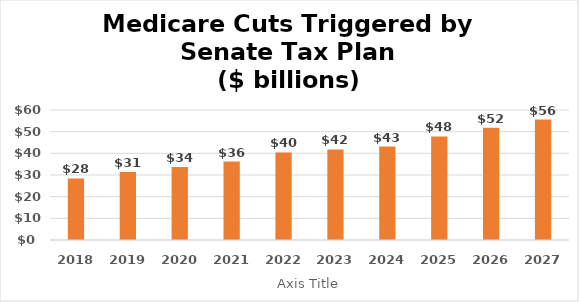
| Category | 4% sequestration |
|---|---|
| 2018.0 | 28.433 |
| 2019.0 | 31.347 |
| 2020.0 | 33.669 |
| 2021.0 | 36.2 |
| 2022.0 | 40.441 |
| 2023.0 | 41.804 |
| 2024.0 | 43.116 |
| 2025.0 | 47.776 |
| 2026.0 | 51.803 |
| 2027.0 | 55.587 |